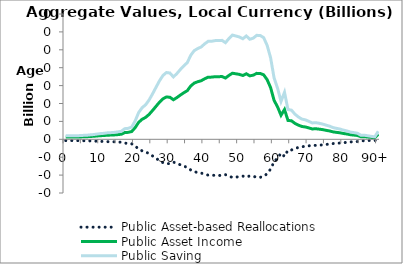
| Category | Public Asset-based Reallocations | Public Asset Income | Public Saving |
|---|---|---|---|
| 0 | -1.438 | 2.494 | 3.932 |
|  | -1.44 | 2.497 | 3.938 |
| 2 | -1.421 | 2.464 | 3.885 |
| 3 | -1.457 | 2.526 | 3.982 |
| 4 | -1.507 | 2.612 | 4.119 |
| 5 | -1.601 | 2.776 | 4.378 |
| 6 | -1.652 | 2.865 | 4.517 |
| 7 | -1.804 | 3.128 | 4.932 |
| 8 | -1.937 | 3.358 | 5.295 |
| 9 | -2.135 | 3.702 | 5.837 |
| 10 | -2.324 | 4.03 | 6.354 |
| 11 | -2.441 | 4.232 | 6.673 |
| 12 | -2.644 | 4.584 | 7.228 |
| 13 | -2.715 | 4.707 | 7.422 |
| 14 | -2.826 | 4.9 | 7.726 |
| 15 | -3.023 | 5.241 | 8.263 |
| 16 | -3.26 | 5.653 | 8.913 |
| 17 | -4.338 | 7.521 | 11.859 |
| 18 | -4.48 | 7.767 | 12.247 |
| 19 | -5.023 | 8.709 | 13.732 |
| 20 | -7.542 | 13.076 | 20.618 |
| 21 | -10.937 | 18.963 | 29.9 |
| 22 | -12.918 | 22.397 | 35.315 |
| 23 | -14.105 | 24.457 | 38.562 |
| 24 | -16.044 | 27.817 | 43.861 |
| 25 | -18.566 | 32.191 | 50.757 |
| 26 | -21.251 | 36.846 | 58.097 |
| 27 | -23.903 | 41.444 | 65.348 |
| 28 | -26.092 | 45.239 | 71.331 |
| 29 | -27.293 | 47.322 | 74.615 |
| 30 | -27.087 | 46.964 | 74.051 |
| 31 | -25.492 | 44.199 | 69.691 |
| 32 | -26.857 | 46.566 | 73.424 |
| 33 | -28.508 | 49.428 | 77.936 |
| 34 | -30.004 | 52.023 | 82.027 |
| 35 | -31.323 | 54.308 | 85.631 |
| 36 | -34.338 | 59.537 | 93.875 |
| 37 | -36.23 | 62.817 | 99.047 |
| 38 | -37.092 | 64.312 | 101.404 |
| 39 | -37.735 | 65.426 | 103.16 |
| 40 | -38.993 | 67.607 | 106.6 |
| 41 | -40.027 | 69.401 | 109.428 |
| 42 | -40.07 | 69.475 | 109.545 |
| 43 | -40.328 | 69.922 | 110.25 |
| 44 | -40.349 | 69.959 | 110.309 |
| 45 | -40.434 | 70.107 | 110.541 |
| 46 | -39.492 | 68.472 | 107.964 |
| 47 | -41.172 | 71.386 | 112.558 |
| 48 | -42.596 | 73.855 | 116.452 |
| 49 | -42.209 | 73.184 | 115.393 |
| 50 | -41.834 | 72.534 | 114.368 |
| 51 | -41.102 | 71.264 | 112.367 |
| 52 | -42.222 | 73.205 | 115.427 |
| 53 | -40.898 | 70.911 | 111.809 |
| 54 | -41.338 | 71.674 | 113.012 |
| 55 | -42.485 | 73.663 | 116.148 |
| 56 | -42.431 | 73.569 | 116 |
| 57 | -41.537 | 72.019 | 113.556 |
| 58 | -38.392 | 66.566 | 104.959 |
| 59 | -33.307 | 57.749 | 91.055 |
| 60 | -25.073 | 43.473 | 68.546 |
| 61 | -20.893 | 36.224 | 57.117 |
| 62 | -15.488 | 26.854 | 42.343 |
| 63 | -19.2 | 33.289 | 52.489 |
| 64 | -12.155 | 21.075 | 33.231 |
| 65 | -11.927 | 20.679 | 32.606 |
| 66 | -10.274 | 17.813 | 28.087 |
| 67 | -9.124 | 15.819 | 24.943 |
| 68 | -8.263 | 14.326 | 22.589 |
| 69 | -7.949 | 13.782 | 21.731 |
| 70 | -7.343 | 12.731 | 20.073 |
| 71 | -6.674 | 11.571 | 18.245 |
| 72 | -6.805 | 11.798 | 18.603 |
| 73 | -6.537 | 11.334 | 17.87 |
| 74 | -6.218 | 10.781 | 16.999 |
| 75 | -5.773 | 10.01 | 15.783 |
| 76 | -5.361 | 9.295 | 14.656 |
| 77 | -4.771 | 8.273 | 13.044 |
| 78 | -4.453 | 7.721 | 12.175 |
| 79 | -4.18 | 7.248 | 11.429 |
| 80 | -3.734 | 6.474 | 10.208 |
| 81 | -3.407 | 5.907 | 9.313 |
| 82 | -2.946 | 5.108 | 8.054 |
| 83 | -2.718 | 4.713 | 7.432 |
| 84 | -2.475 | 4.292 | 6.767 |
| 85 | -1.65 | 2.861 | 4.511 |
| 86 | -1.68 | 2.912 | 4.592 |
| 87 | -1.442 | 2.5 | 3.942 |
| 88 | -1.197 | 2.075 | 3.271 |
| 89 | -1.011 | 1.754 | 2.765 |
| 90+ | -3.279 | 5.685 | 8.964 |